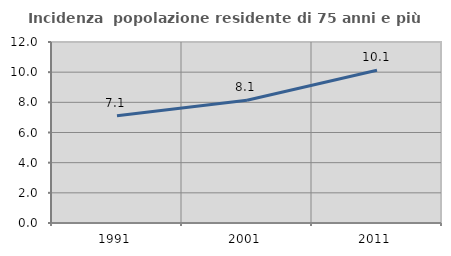
| Category | Incidenza  popolazione residente di 75 anni e più |
|---|---|
| 1991.0 | 7.105 |
| 2001.0 | 8.14 |
| 2011.0 | 10.132 |